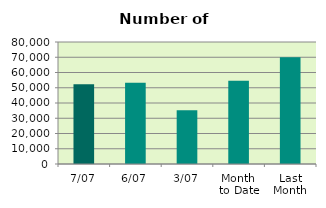
| Category | Series 0 |
|---|---|
| 7/07 | 52228 |
| 6/07 | 53258 |
| 3/07 | 35246 |
| Month 
to Date | 54648.8 |
| Last
Month | 70062.455 |